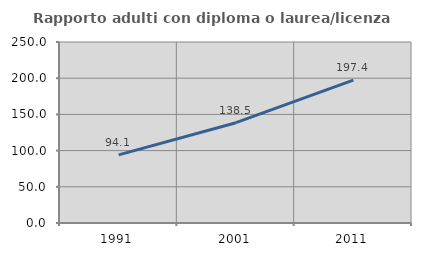
| Category | Rapporto adulti con diploma o laurea/licenza media  |
|---|---|
| 1991.0 | 94.066 |
| 2001.0 | 138.532 |
| 2011.0 | 197.44 |